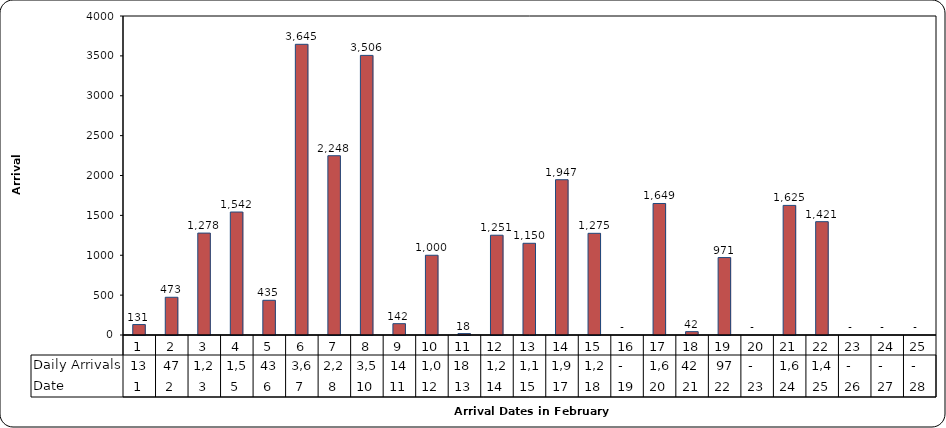
| Category | Daily Arrivals |
|---|---|
| 0 | 131 |
| 1 | 473 |
| 2 | 1278 |
| 3 | 1542 |
| 4 | 435 |
| 5 | 3645 |
| 6 | 2248 |
| 7 | 3506 |
| 8 | 142 |
| 9 | 1000 |
| 10 | 18 |
| 11 | 1251 |
| 12 | 1150 |
| 13 | 1947 |
| 14 | 1275 |
| 15 | 0 |
| 16 | 1649 |
| 17 | 42 |
| 18 | 971 |
| 19 | 0 |
| 20 | 1625 |
| 21 | 1421 |
| 22 | 0 |
| 23 | 0 |
| 24 | 0 |